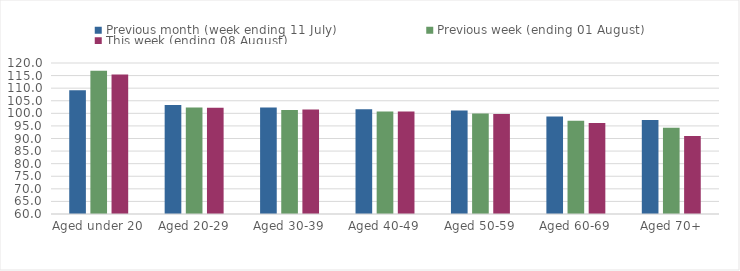
| Category | Previous month (week ending 11 July) | Previous week (ending 01 August) | This week (ending 08 August) |
|---|---|---|---|
| Aged under 20 | 109.169 | 116.957 | 115.457 |
| Aged 20-29 | 103.335 | 102.3 | 102.226 |
| Aged 30-39 | 102.3 | 101.337 | 101.514 |
| Aged 40-49 | 101.633 | 100.769 | 100.723 |
| Aged 50-59 | 101.101 | 99.898 | 99.744 |
| Aged 60-69 | 98.759 | 97.02 | 96.133 |
| Aged 70+ | 97.338 | 94.227 | 91 |